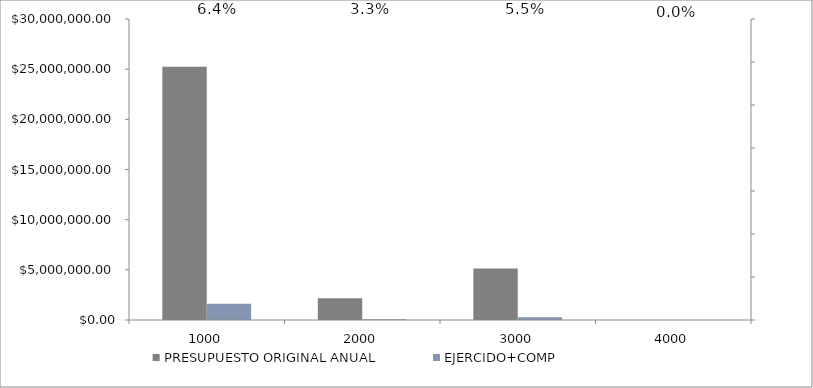
| Category | PRESUPUESTO ORIGINAL ANUAL | EJERCIDO+COMP |
|---|---|---|
| 1000.0 | 25241362 | 1627457.88 |
| 2000.0 | 2171807 | 71298.82 |
| 3000.0 | 5128874 | 281173.81 |
| 4000.0 | 0 | 0 |